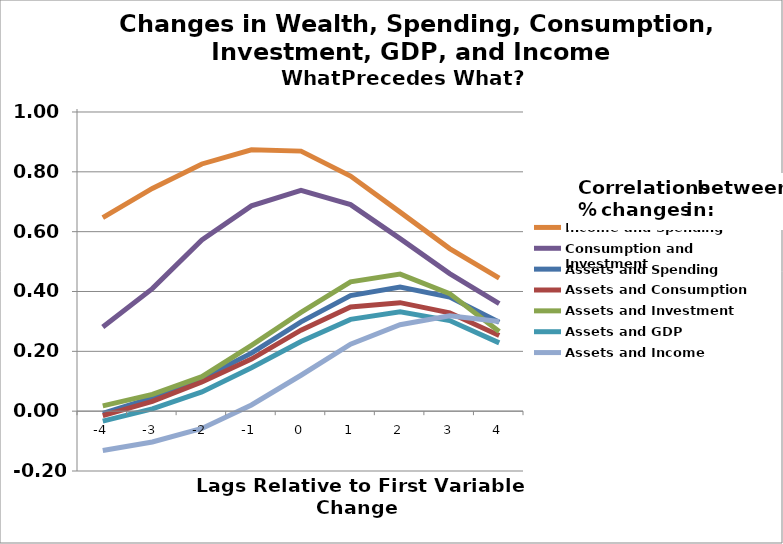
| Category | Income and Spending | Consumption and Investment | Assets and Spending | Assets and Consumption | Assets and Investment | Assets and GDP | Assets and Income |
|---|---|---|---|---|---|---|---|
| -4.0 | 0.647 | 0.282 | -0.008 | -0.015 | 0.017 | -0.033 | -0.131 |
| -3.0 | 0.745 | 0.41 | 0.044 | 0.033 | 0.056 | 0.008 | -0.103 |
| -2.0 | 0.826 | 0.572 | 0.109 | 0.098 | 0.115 | 0.064 | -0.058 |
| -1.0 | 0.874 | 0.686 | 0.194 | 0.174 | 0.22 | 0.145 | 0.021 |
| 0.0 | 0.869 | 0.738 | 0.299 | 0.271 | 0.33 | 0.233 | 0.12 |
| 1.0 | 0.786 | 0.691 | 0.386 | 0.348 | 0.432 | 0.307 | 0.224 |
| 2.0 | 0.665 | 0.577 | 0.415 | 0.363 | 0.458 | 0.332 | 0.289 |
| 3.0 | 0.543 | 0.46 | 0.381 | 0.329 | 0.393 | 0.303 | 0.319 |
| 4.0 | 0.445 | 0.359 | 0.297 | 0.253 | 0.266 | 0.228 | 0.3 |